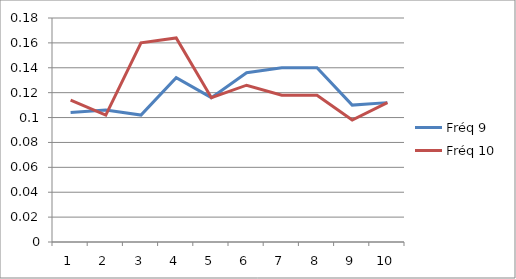
| Category | Fréq 9 | Fréq 10 |
|---|---|---|
| 1.0 | 0.104 | 0.114 |
| 2.0 | 0.106 | 0.102 |
| 3.0 | 0.102 | 0.16 |
| 4.0 | 0.132 | 0.164 |
| 5.0 | 0.116 | 0.116 |
| 6.0 | 0.136 | 0.126 |
| 7.0 | 0.14 | 0.118 |
| 8.0 | 0.14 | 0.118 |
| 9.0 | 0.11 | 0.098 |
| 10.0 | 0.112 | 0.112 |